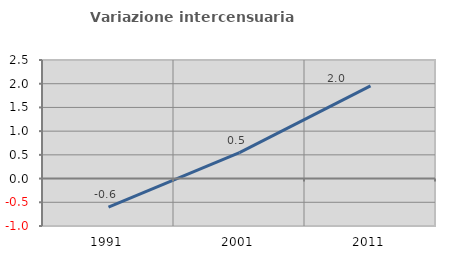
| Category | Variazione intercensuaria annua |
|---|---|
| 1991.0 | -0.602 |
| 2001.0 | 0.547 |
| 2011.0 | 1.956 |